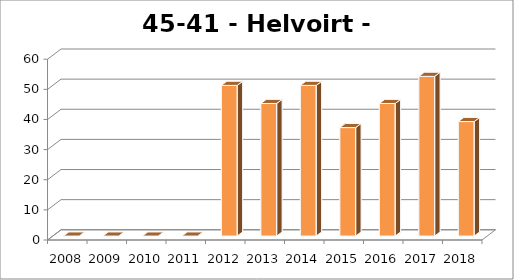
| Category | Helvoirt - Cromvoirt |
|---|---|
| 2008.0 | 0 |
| 2009.0 | 0 |
| 2010.0 | 0 |
| 2011.0 | 0 |
| 2012.0 | 50 |
| 2013.0 | 44 |
| 2014.0 | 50 |
| 2015.0 | 36 |
| 2016.0 | 44 |
| 2017.0 | 53 |
| 2018.0 | 38 |